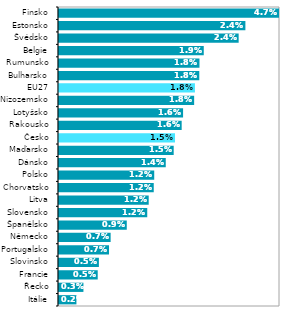
| Category | Series 0 |
|---|---|
| Itálie | 0.002 |
| Řecko | 0.003 |
| Francie | 0.005 |
| Slovinsko | 0.005 |
| Portugalsko | 0.007 |
| Německo | 0.007 |
| Španělsko | 0.009 |
| Slovensko | 0.012 |
| Litva | 0.012 |
| Chorvatsko | 0.012 |
| Polsko | 0.012 |
| Dánsko | 0.014 |
| Maďarsko | 0.015 |
| Česko | 0.015 |
| Rakousko | 0.016 |
| Lotyšsko | 0.016 |
| Nizozemsko | 0.018 |
| EU27 | 0.018 |
| Bulharsko | 0.018 |
| Rumunsko | 0.018 |
| Belgie | 0.019 |
| Švédsko | 0.024 |
| Estonsko | 0.024 |
| Finsko | 0.047 |